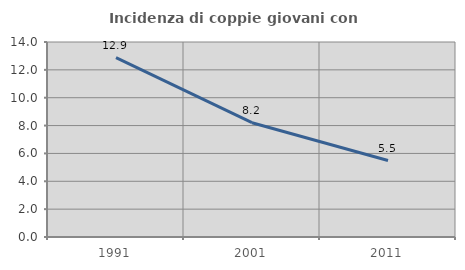
| Category | Incidenza di coppie giovani con figli |
|---|---|
| 1991.0 | 12.881 |
| 2001.0 | 8.206 |
| 2011.0 | 5.491 |